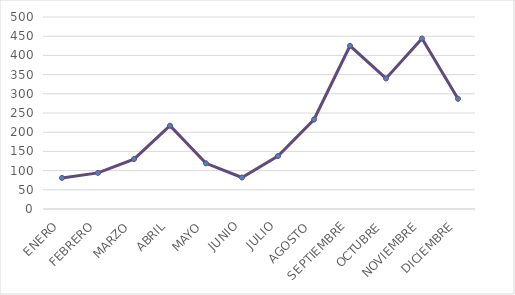
| Category | Series 0 |
|---|---|
| ENERO | 81 |
| FEBRERO | 94 |
| MARZO | 130 |
| ABRIL | 217 |
| MAYO | 119 |
| JUNIO | 82 |
| JULIO | 138 |
| AGOSTO | 233 |
| SEPTIEMBRE | 425 |
| OCTUBRE | 340 |
| NOVIEMBRE | 444 |
| DICIEMBRE | 287 |